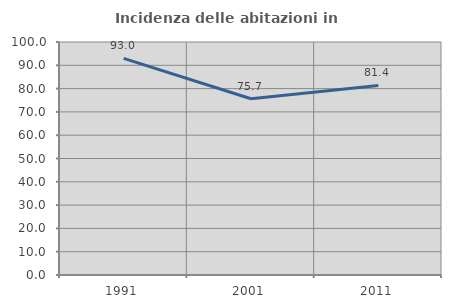
| Category | Incidenza delle abitazioni in proprietà  |
|---|---|
| 1991.0 | 92.991 |
| 2001.0 | 75.664 |
| 2011.0 | 81.356 |